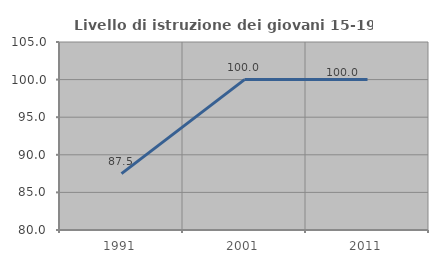
| Category | Livello di istruzione dei giovani 15-19 anni |
|---|---|
| 1991.0 | 87.5 |
| 2001.0 | 100 |
| 2011.0 | 100 |